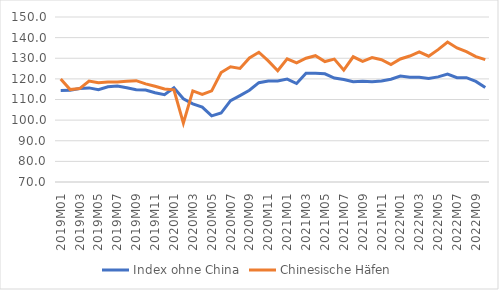
| Category | Index ohne China | Chinesische Häfen |
|---|---|---|
| 2019M01 | 114.358 | 119.944 |
| 2019M02 | 114.427 | 114.808 |
| 2019M03 | 115.362 | 115.302 |
| 2019M04 | 115.624 | 118.958 |
| 2019M05 | 114.704 | 118.112 |
| 2019M06 | 116.162 | 118.427 |
| 2019M07 | 116.511 | 118.485 |
| 2019M08 | 115.653 | 118.85 |
| 2019M09 | 114.774 | 119.122 |
| 2019M10 | 114.576 | 117.582 |
| 2019M11 | 113.295 | 116.435 |
| 2019M12 | 112.352 | 115.084 |
| 2020M01 | 115.718 | 114.676 |
| 2020M02 | 110.358 | 98.546 |
| 2020M03 | 107.884 | 114.167 |
| 2020M04 | 106.305 | 112.516 |
| 2020M05 | 102.086 | 114.167 |
| 2020M06 | 103.425 | 123.052 |
| 2020M07 | 109.431 | 125.869 |
| 2020M08 | 111.892 | 125.041 |
| 2020M09 | 114.476 | 130.132 |
| 2020M10 | 118.163 | 132.907 |
| 2020M11 | 118.992 | 128.7 |
| 2020M12 | 118.976 | 123.961 |
| 2021M01 | 119.895 | 129.73 |
| 2021M02 | 117.739 | 127.802 |
| 2021M03 | 122.69 | 130.014 |
| 2021M04 | 122.7 | 131.231 |
| 2021M05 | 122.481 | 128.416 |
| 2021M06 | 120.426 | 129.586 |
| 2021M07 | 119.66 | 124.234 |
| 2021M08 | 118.655 | 130.714 |
| 2021M09 | 118.903 | 128.502 |
| 2021M10 | 118.553 | 130.294 |
| 2021M11 | 118.964 | 129.262 |
| 2021M12 | 119.847 | 126.896 |
| 2022M01 | 121.341 | 129.647 |
| 2022M02 | 120.794 | 131.074 |
| 2022M03 | 120.753 | 133.083 |
| 2022M04 | 120.166 | 130.976 |
| 2022M05 | 120.958 | 134.186 |
| 2022M06 | 122.291 | 137.868 |
| 2022M07 | 120.547 | 135.006 |
| 2022M08 | 120.602 | 133.167 |
| 2022M09 | 118.775 | 130.821 |
| 2022M10 | 115.766 | 129.301 |